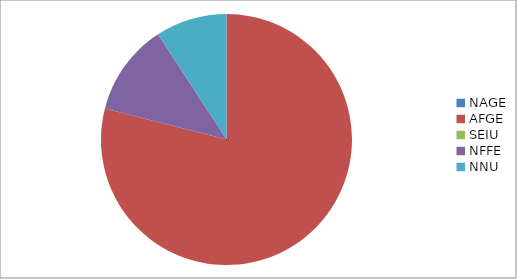
| Category | Series 0 |
|---|---|
| NAGE | 0 |
| AFGE | 8353 |
| SEIU | 0 |
| NFFE | 1252 |
| NNU | 970 |